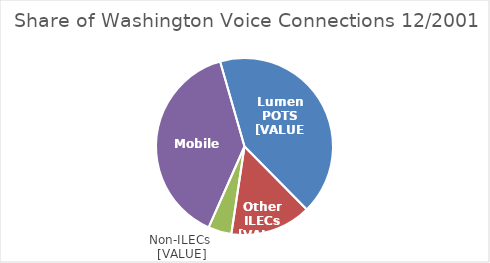
| Category | Series 0 |
|---|---|
| Lumen - POTS | 0.42 |
| Other ILECs | 0.148 |
| Non-ILECs | 0.043 |
| Mobile | 0.389 |